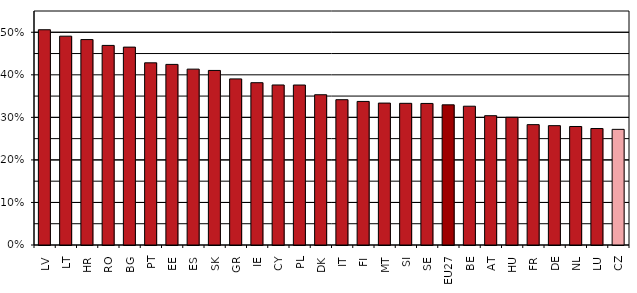
| Category | Series 0 |
|---|---|
| LV | 0.506 |
| LT | 0.491 |
| HR | 0.483 |
| RO | 0.469 |
| BG | 0.465 |
| PT | 0.428 |
| EE | 0.424 |
| ES | 0.413 |
| SK | 0.41 |
| GR | 0.39 |
| IE | 0.381 |
| CY | 0.376 |
| PL | 0.376 |
| DK | 0.353 |
| IT | 0.342 |
| FI | 0.337 |
| MT | 0.334 |
| SI | 0.333 |
| SE | 0.333 |
| EU27 | 0.329 |
| BE | 0.326 |
| AT | 0.304 |
| HU | 0.3 |
| FR | 0.283 |
| DE | 0.281 |
| NL | 0.279 |
| LU | 0.274 |
| CZ | 0.272 |